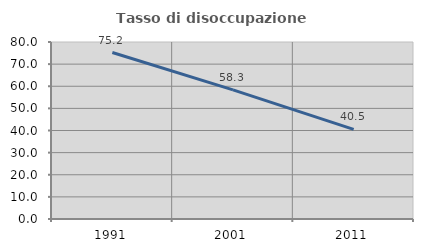
| Category | Tasso di disoccupazione giovanile  |
|---|---|
| 1991.0 | 75.238 |
| 2001.0 | 58.333 |
| 2011.0 | 40.541 |